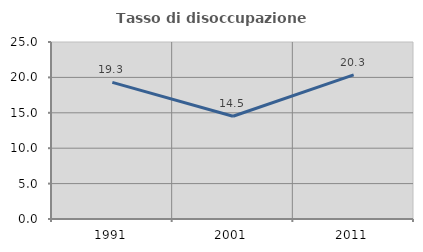
| Category | Tasso di disoccupazione giovanile  |
|---|---|
| 1991.0 | 19.303 |
| 2001.0 | 14.516 |
| 2011.0 | 20.349 |